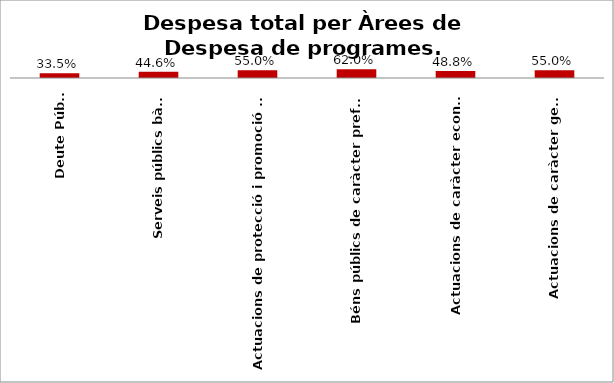
| Category | Series 0 |
|---|---|
| Deute Públic | 0.335 |
| Serveis públics bàsics | 0.446 |
| Actuacions de protecció i promoció social | 0.55 |
| Béns públics de caràcter preferent | 0.62 |
| Actuacions de caràcter econòmic | 0.488 |
| Actuacions de caràcter general | 0.55 |